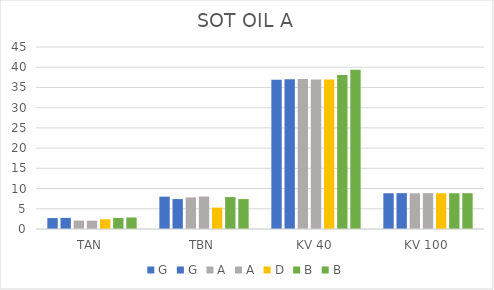
| Category | G | A | D | B |
|---|---|---|---|---|
| TAN | 2.75 | 2.06 | 2.4 | 2.85 |
| TBN | 7.4 | 8.04 | 5.3 | 7.4 |
| KV 40 | 37 | 36.99 | 36.98 | 39.36 |
| KV 100 | 8.86 | 8.87 | 8.834 | 8.85 |